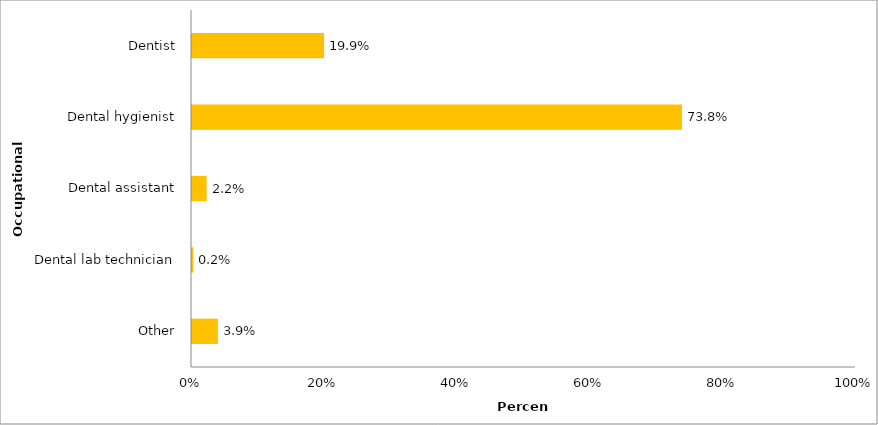
| Category | Series 0 |
|---|---|
| Other | 0.039 |
| Dental lab technician | 0.002 |
| Dental assistant | 0.022 |
| Dental hygienist | 0.738 |
| Dentist | 0.199 |